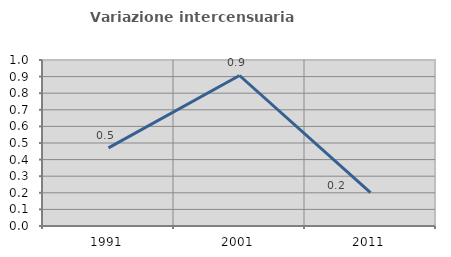
| Category | Variazione intercensuaria annua |
|---|---|
| 1991.0 | 0.471 |
| 2001.0 | 0.907 |
| 2011.0 | 0.201 |